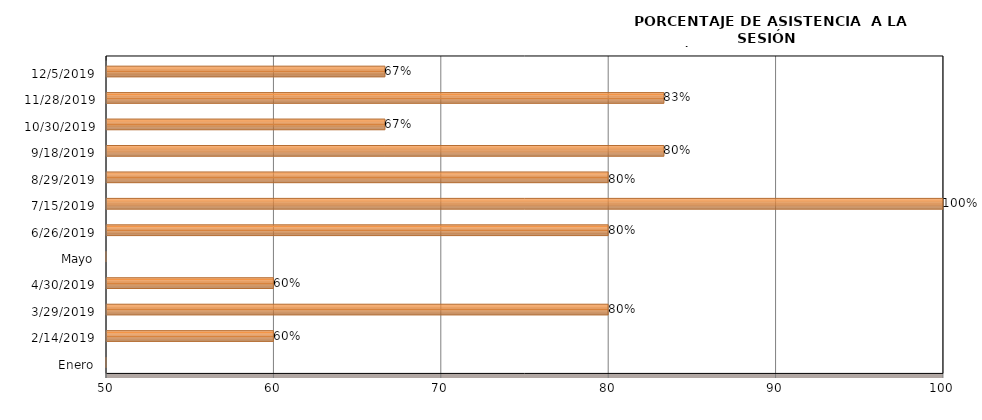
| Category | Series 0 |
|---|---|
| Enero | 0 |
| 14/02/2019 | 60 |
| 29/03/2019 | 80 |
| 30/04/2019 | 60 |
| Mayo | 0 |
| 26/06/2019 | 80 |
| 15/07/2019 | 100 |
| 29/08/2019 | 80 |
| 18/09/2019 | 83.333 |
| 30/10/2019 | 66.667 |
| 28/11/2019 | 83.333 |
| 05/12/2019 | 66.667 |